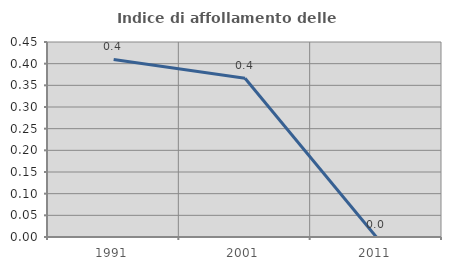
| Category | Indice di affollamento delle abitazioni  |
|---|---|
| 1991.0 | 0.41 |
| 2001.0 | 0.366 |
| 2011.0 | 0 |